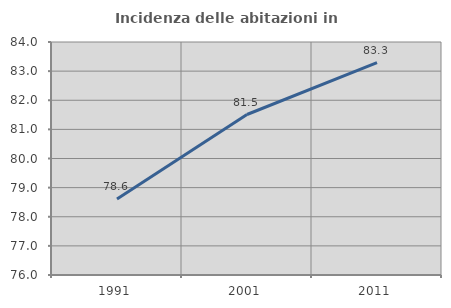
| Category | Incidenza delle abitazioni in proprietà  |
|---|---|
| 1991.0 | 78.611 |
| 2001.0 | 81.51 |
| 2011.0 | 83.295 |